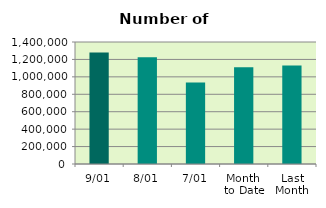
| Category | Series 0 |
|---|---|
| 9/01 | 1279918 |
| 8/01 | 1225644 |
| 7/01 | 934050 |
| Month 
to Date | 1109811.667 |
| Last
Month | 1131500.526 |